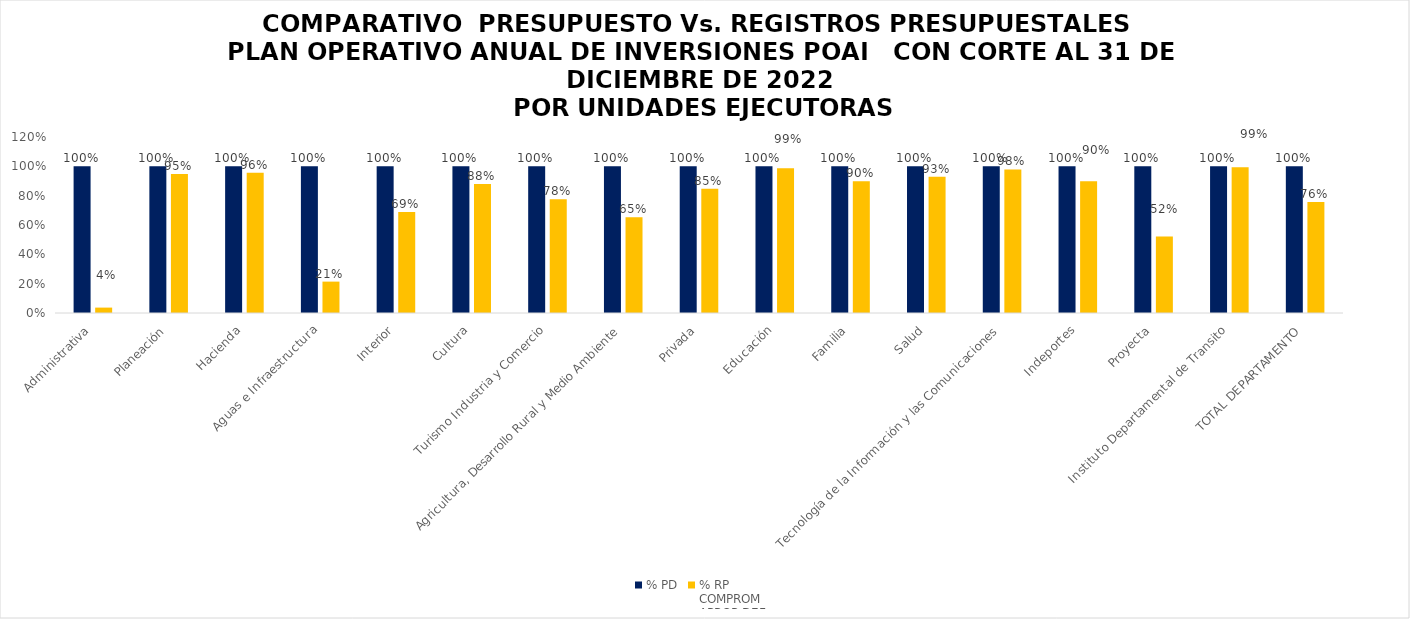
| Category | % PD | % RP
COMPROM
APROP DEF |
|---|---|---|
| Administrativa | 1 | 0.037 |
| Planeación | 1 | 0.948 |
| Hacienda | 1 | 0.956 |
| Aguas e Infraestructura | 1 | 0.214 |
| Interior | 1 | 0.688 |
| Cultura | 1 | 0.88 |
| Turismo Industria y Comercio | 1 | 0.776 |
| Agricultura, Desarrollo Rural y Medio Ambiente | 1 | 0.653 |
| Privada | 1 | 0.848 |
| Educación | 1 | 0.987 |
| Familia | 1 | 0.898 |
| Salud | 1 | 0.93 |
| Tecnología de la Información y las Comunicaciones | 1 | 0.979 |
| Indeportes | 1 | 0.899 |
| Proyecta | 1 | 0.521 |
| Instituto Departamental de Transito | 1 | 0.994 |
| TOTAL DEPARTAMENTO | 1 | 0.758 |